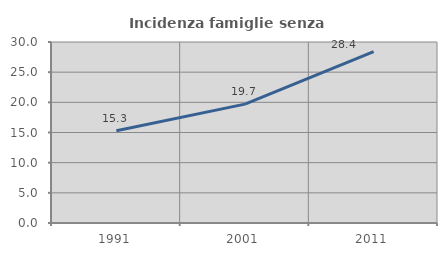
| Category | Incidenza famiglie senza nuclei |
|---|---|
| 1991.0 | 15.294 |
| 2001.0 | 19.706 |
| 2011.0 | 28.402 |